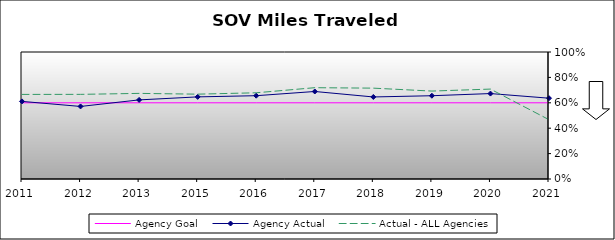
| Category | Agency Goal | Agency Actual | Actual - ALL Agencies |
|---|---|---|---|
| 2011.0 | 0.6 | 0.611 | 0.666 |
| 2012.0 | 0.6 | 0.571 | 0.666 |
| 2013.0 | 0.6 | 0.623 | 0.674 |
| 2015.0 | 0.6 | 0.647 | 0.668 |
| 2016.0 | 0.6 | 0.656 | 0.679 |
| 2017.0 | 0.6 | 0.689 | 0.719 |
| 2018.0 | 0.6 | 0.646 | 0.715 |
| 2019.0 | 0.6 | 0.656 | 0.692 |
| 2020.0 | 0.6 | 0.673 | 0.708 |
| 2021.0 | 0.6 | 0.636 | 0.467 |